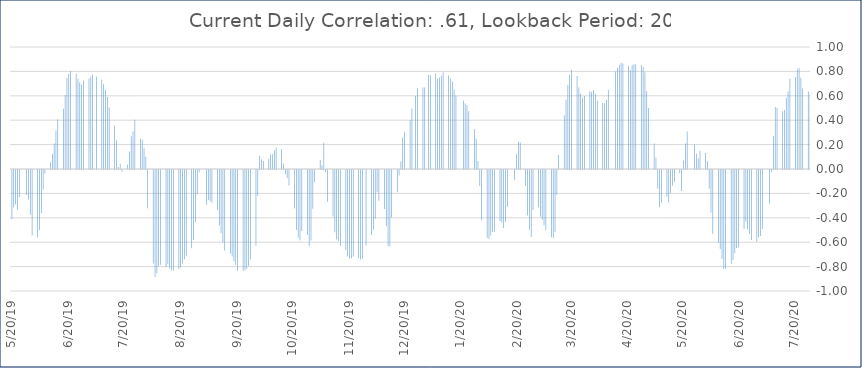
| Category | Series 0 |
|---|---|
| 7/28/20 | 0.608 |
| 7/27/20 | 0.635 |
| 7/24/20 | 0.663 |
| 7/23/20 | 0.748 |
| 7/22/20 | 0.829 |
| 7/21/20 | 0.817 |
| 7/20/20 | 0.754 |
| 7/17/20 | 0.739 |
| 7/16/20 | 0.637 |
| 7/15/20 | 0.583 |
| 7/14/20 | 0.484 |
| 7/13/20 | 0.474 |
| 7/10/20 | 0.5 |
| 7/9/20 | 0.509 |
| 7/8/20 | 0.27 |
| 7/7/20 | -0.015 |
| 7/6/20 | -0.276 |
| 7/2/20 | -0.483 |
| 7/1/20 | -0.541 |
| 6/30/20 | -0.551 |
| 6/29/20 | -0.588 |
| 6/26/20 | -0.573 |
| 6/25/20 | -0.525 |
| 6/24/20 | -0.484 |
| 6/23/20 | -0.424 |
| 6/22/20 | -0.481 |
| 6/19/20 | -0.634 |
| 6/18/20 | -0.64 |
| 6/17/20 | -0.683 |
| 6/16/20 | -0.737 |
| 6/15/20 | -0.77 |
| 6/12/20 | -0.809 |
| 6/11/20 | -0.812 |
| 6/10/20 | -0.729 |
| 6/9/20 | -0.648 |
| 6/8/20 | -0.596 |
| 6/5/20 | -0.525 |
| 6/4/20 | -0.349 |
| 6/3/20 | -0.153 |
| 6/2/20 | 0.064 |
| 6/1/20 | 0.131 |
| 5/29/20 | 0.149 |
| 5/28/20 | 0.085 |
| 5/27/20 | 0.125 |
| 5/26/20 | 0.202 |
| 5/22/20 | 0.308 |
| 5/21/20 | 0.21 |
| 5/20/20 | 0.069 |
| 5/19/20 | -0.172 |
| 5/18/20 | -0.026 |
| 5/15/20 | -0.099 |
| 5/14/20 | -0.128 |
| 5/13/20 | -0.191 |
| 5/12/20 | -0.267 |
| 5/11/20 | -0.218 |
| 5/8/20 | -0.268 |
| 5/7/20 | -0.305 |
| 5/6/20 | -0.153 |
| 5/5/20 | 0.094 |
| 5/4/20 | 0.209 |
| 5/1/20 | 0.501 |
| 4/30/20 | 0.638 |
| 4/29/20 | 0.794 |
| 4/28/20 | 0.837 |
| 4/27/20 | 0.851 |
| 4/24/20 | 0.859 |
| 4/23/20 | 0.858 |
| 4/22/20 | 0.852 |
| 4/21/20 | 0.809 |
| 4/20/20 | 0.847 |
| 4/17/20 | 0.865 |
| 4/16/20 | 0.871 |
| 4/15/20 | 0.854 |
| 4/14/20 | 0.83 |
| 4/13/20 | 0.8 |
| 4/9/20 | 0.649 |
| 4/8/20 | 0.568 |
| 4/7/20 | 0.538 |
| 4/6/20 | 0.54 |
| 4/3/20 | 0.559 |
| 4/2/20 | 0.614 |
| 4/1/20 | 0.647 |
| 3/31/20 | 0.632 |
| 3/30/20 | 0.638 |
| 3/27/20 | 0.599 |
| 3/26/20 | 0.586 |
| 3/25/20 | 0.62 |
| 3/24/20 | 0.669 |
| 3/23/20 | 0.761 |
| 3/20/20 | 0.814 |
| 3/19/20 | 0.772 |
| 3/18/20 | 0.69 |
| 3/17/20 | 0.568 |
| 3/16/20 | 0.44 |
| 3/13/20 | 0.115 |
| 3/12/20 | -0.202 |
| 3/11/20 | -0.507 |
| 3/10/20 | -0.557 |
| 3/9/20 | -0.553 |
| 3/6/20 | -0.495 |
| 3/5/20 | -0.453 |
| 3/4/20 | -0.407 |
| 3/3/20 | -0.382 |
| 3/2/20 | -0.308 |
| 2/28/20 | -0.328 |
| 2/27/20 | -0.55 |
| 2/26/20 | -0.49 |
| 2/25/20 | -0.372 |
| 2/24/20 | -0.132 |
| 2/21/20 | 0.217 |
| 2/20/20 | 0.226 |
| 2/19/20 | 0.123 |
| 2/18/20 | -0.082 |
| 2/14/20 | -0.301 |
| 2/13/20 | -0.427 |
| 2/12/20 | -0.476 |
| 2/11/20 | -0.43 |
| 2/10/20 | -0.417 |
| 2/7/20 | -0.506 |
| 2/6/20 | -0.507 |
| 2/5/20 | -0.536 |
| 2/4/20 | -0.564 |
| 2/3/20 | -0.557 |
| 1/31/20 | -0.412 |
| 1/30/20 | -0.131 |
| 1/29/20 | 0.065 |
| 1/28/20 | 0.25 |
| 1/27/20 | 0.328 |
| 1/24/20 | 0.474 |
| 1/23/20 | 0.525 |
| 1/22/20 | 0.536 |
| 1/21/20 | 0.562 |
| 1/17/20 | 0.603 |
| 1/16/20 | 0.651 |
| 1/15/20 | 0.717 |
| 1/14/20 | 0.741 |
| 1/13/20 | 0.768 |
| 1/10/20 | 0.793 |
| 1/9/20 | 0.764 |
| 1/8/20 | 0.75 |
| 1/7/20 | 0.739 |
| 1/6/20 | 0.784 |
| 1/3/20 | 0.766 |
| 1/2/20 | 0.77 |
| 12/31/19 | 0.668 |
| 12/30/19 | 0.668 |
| 12/27/19 | 0.661 |
| 12/26/19 | 0.599 |
| 12/24/19 | 0.497 |
| 12/23/19 | 0.401 |
| 12/20/19 | 0.305 |
| 12/19/19 | 0.257 |
| 12/18/19 | 0.062 |
| 12/17/19 | -0.045 |
| 12/16/19 | -0.182 |
| 12/13/19 | -0.388 |
| 12/12/19 | -0.626 |
| 12/11/19 | -0.626 |
| 12/10/19 | -0.461 |
| 12/9/19 | -0.32 |
| 12/6/19 | -0.252 |
| 12/5/19 | -0.183 |
| 12/4/19 | -0.399 |
| 12/3/19 | -0.49 |
| 12/2/19 | -0.534 |
| 11/29/19 | -0.619 |
| 11/27/19 | -0.73 |
| 11/26/19 | -0.735 |
| 11/25/19 | -0.722 |
| 11/22/19 | -0.709 |
| 11/21/19 | -0.724 |
| 11/20/19 | -0.726 |
| 11/19/19 | -0.709 |
| 11/18/19 | -0.656 |
| 11/15/19 | -0.623 |
| 11/14/19 | -0.581 |
| 11/13/19 | -0.569 |
| 11/12/19 | -0.511 |
| 11/11/19 | -0.38 |
| 11/8/19 | -0.261 |
| 11/7/19 | -0.018 |
| 11/6/19 | 0.217 |
| 11/5/19 | 0.031 |
| 11/4/19 | 0.075 |
| 11/1/19 | -0.1 |
| 10/31/19 | -0.317 |
| 10/30/19 | -0.577 |
| 10/29/19 | -0.625 |
| 10/28/19 | -0.532 |
| 10/25/19 | -0.497 |
| 10/24/19 | -0.575 |
| 10/23/19 | -0.554 |
| 10/22/19 | -0.491 |
| 10/21/19 | -0.316 |
| 10/18/19 | -0.127 |
| 10/17/19 | -0.066 |
| 10/16/19 | -0.035 |
| 10/15/19 | 0.046 |
| 10/14/19 | 0.162 |
| 10/11/19 | 0.176 |
| 10/10/19 | 0.152 |
| 10/9/19 | 0.121 |
| 10/8/19 | 0.119 |
| 10/7/19 | 0.082 |
| 10/4/19 | 0.066 |
| 10/3/19 | 0.08 |
| 10/2/19 | 0.109 |
| 10/1/19 | -0.213 |
| 9/30/19 | -0.621 |
| 9/27/19 | -0.734 |
| 9/26/19 | -0.787 |
| 9/25/19 | -0.81 |
| 9/24/19 | -0.822 |
| 9/23/19 | -0.826 |
| 9/20/19 | -0.826 |
| 9/19/19 | -0.778 |
| 9/18/19 | -0.749 |
| 9/17/19 | -0.71 |
| 9/16/19 | -0.686 |
| 9/13/19 | -0.66 |
| 9/12/19 | -0.595 |
| 9/11/19 | -0.519 |
| 9/10/19 | -0.456 |
| 9/9/19 | -0.33 |
| 9/6/19 | -0.268 |
| 9/5/19 | -0.257 |
| 9/4/19 | -0.246 |
| 9/3/19 | -0.285 |
| 8/30/19 | -0.021 |
| 8/29/19 | -0.2 |
| 8/28/19 | -0.426 |
| 8/27/19 | -0.571 |
| 8/26/19 | -0.641 |
| 8/23/19 | -0.707 |
| 8/22/19 | -0.733 |
| 8/21/19 | -0.767 |
| 8/20/19 | -0.8 |
| 8/19/19 | -0.811 |
| 8/16/19 | -0.825 |
| 8/15/19 | -0.824 |
| 8/14/19 | -0.805 |
| 8/13/19 | -0.77 |
| 8/12/19 | -0.796 |
| 8/9/19 | -0.777 |
| 8/8/19 | -0.788 |
| 8/7/19 | -0.844 |
| 8/6/19 | -0.878 |
| 8/5/19 | -0.767 |
| 8/2/19 | -0.316 |
| 8/1/19 | 0.099 |
| 7/31/19 | 0.17 |
| 7/30/19 | 0.238 |
| 7/29/19 | 0.247 |
| 7/26/19 | 0.403 |
| 7/25/19 | 0.308 |
| 7/24/19 | 0.268 |
| 7/23/19 | 0.143 |
| 7/22/19 | 0.034 |
| 7/19/19 | -0.015 |
| 7/18/19 | 0.044 |
| 7/17/19 | 0.016 |
| 7/16/19 | 0.236 |
| 7/15/19 | 0.357 |
| 7/12/19 | 0.503 |
| 7/11/19 | 0.59 |
| 7/10/19 | 0.65 |
| 7/9/19 | 0.695 |
| 7/8/19 | 0.732 |
| 7/5/19 | 0.755 |
| 7/3/19 | 0.777 |
| 7/2/19 | 0.759 |
| 7/1/19 | 0.74 |
| 6/28/19 | 0.725 |
| 6/27/19 | 0.693 |
| 6/26/19 | 0.71 |
| 6/25/19 | 0.739 |
| 6/24/19 | 0.781 |
| 6/21/19 | 0.804 |
| 6/20/19 | 0.779 |
| 6/19/19 | 0.746 |
| 6/18/19 | 0.606 |
| 6/17/19 | 0.493 |
| 6/14/19 | 0.408 |
| 6/13/19 | 0.315 |
| 6/12/19 | 0.212 |
| 6/11/19 | 0.124 |
| 6/10/19 | 0.055 |
| 6/7/19 | -0.029 |
| 6/6/19 | -0.161 |
| 6/5/19 | -0.354 |
| 6/4/19 | -0.492 |
| 6/3/19 | -0.554 |
| 5/31/19 | -0.538 |
| 5/30/19 | -0.367 |
| 5/29/19 | -0.242 |
| 5/28/19 | -0.205 |
| 5/24/19 | -0.221 |
| 5/23/19 | -0.328 |
| 5/22/19 | -0.284 |
| 5/21/19 | -0.308 |
| 5/20/19 | -0.404 |